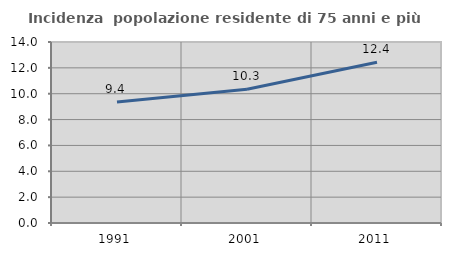
| Category | Incidenza  popolazione residente di 75 anni e più |
|---|---|
| 1991.0 | 9.352 |
| 2001.0 | 10.348 |
| 2011.0 | 12.437 |